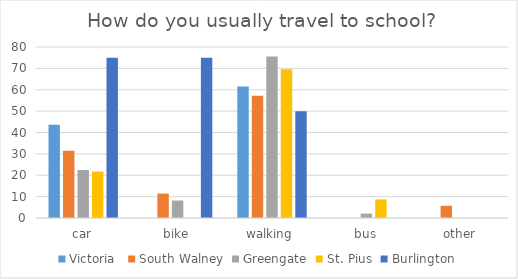
| Category | Victoria  | South Walney | Greengate | St. Pius | Burlington |
|---|---|---|---|---|---|
| car | 43.59 | 31.429 | 22.449 | 21.739 | 75 |
| bike | 0 | 11.429 | 8.163 | 0 | 75 |
| walking | 61.538 | 57.143 | 75.51 | 69.565 | 50 |
| bus | 0 | 0 | 2.041 | 8.696 | 0 |
| other | 0 | 5.714 | 0 | 0 | 0 |